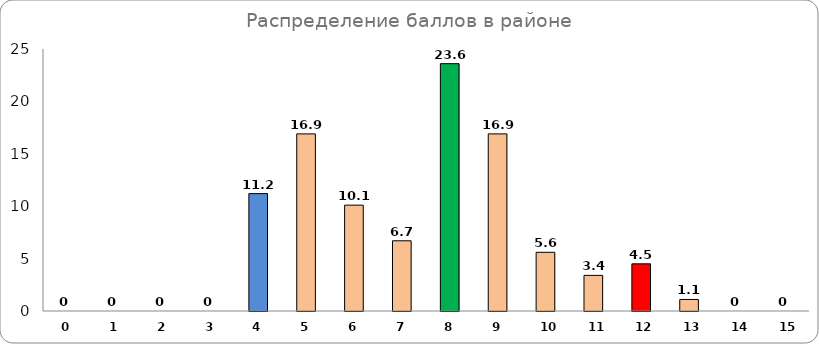
| Category | Series 0 |
|---|---|
| 0.0 | 0 |
| 1.0 | 0 |
| 2.0 | 0 |
| 3.0 | 0 |
| 4.0 | 11.2 |
| 5.0 | 16.9 |
| 6.0 | 10.1 |
| 7.0 | 6.7 |
| 8.0 | 23.6 |
| 9.0 | 16.9 |
| 10.0 | 5.6 |
| 11.0 | 3.4 |
| 12.0 | 4.5 |
| 13.0 | 1.1 |
| 14.0 | 0 |
| 15.0 | 0 |